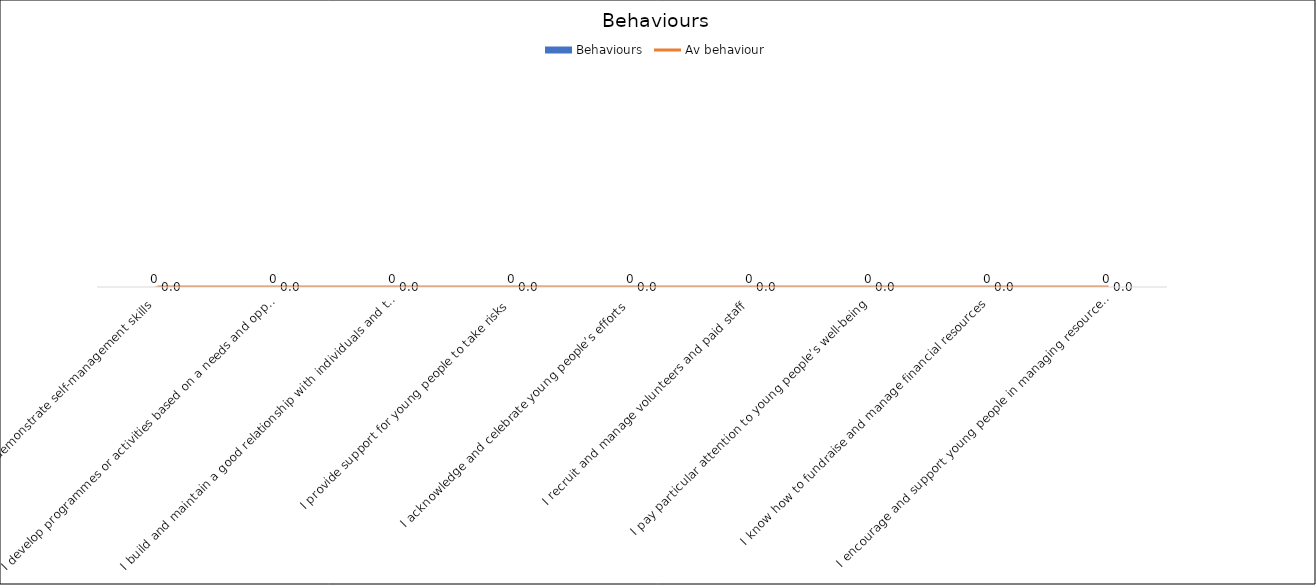
| Category | Behaviours |
|---|---|
| I demonstrate self-management skills | 0 |
| I develop programmes or activities based on a needs and opportunities analysis, including socialising activities | 0 |
| I build and maintain a good relationship with individuals and the entire group of young people, taking their environment into account | 0 |
| I provide support for young people to take risks  | 0 |
| I acknowledge and celebrate young people’s efforts  | 0 |
| I recruit and manage volunteers and paid staff  | 0 |
| I pay particular attention to young people’s well-being | 0 |
| I know how to fundraise and manage financial resources | 0 |
| I encourage and support young people in managing resources – if possible in an environmentally-friendly way | 0 |